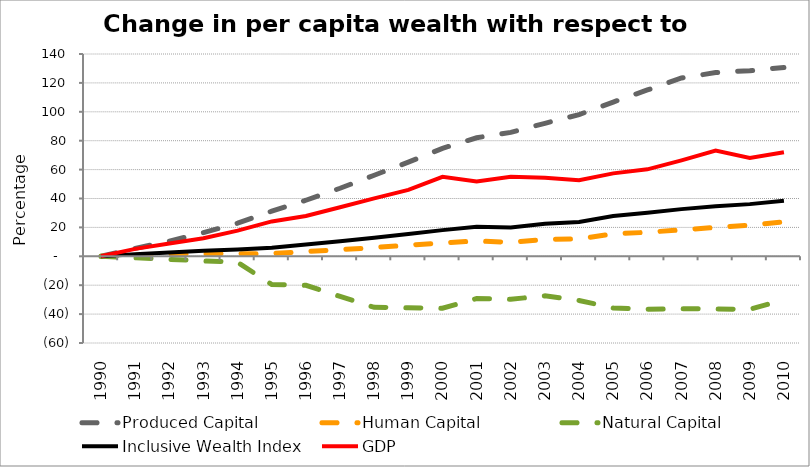
| Category | Produced Capital  | Human Capital | Natural Capital | Inclusive Wealth Index | GDP |
|---|---|---|---|---|---|
| 1990.0 | 0 | 0 | 0 | 0 | 0 |
| 1991.0 | 5.482 | 0.687 | -1.058 | 1.344 | 5.132 |
| 1992.0 | 10.521 | 1.348 | -2.133 | 2.604 | 8.868 |
| 1993.0 | 16.361 | 1.755 | -3.175 | 3.758 | 12.536 |
| 1994.0 | 22.902 | 1.715 | -4.119 | 4.625 | 17.735 |
| 1995.0 | 31.244 | 1.868 | -19.551 | 5.858 | 24.146 |
| 1996.0 | 38.791 | 3.297 | -20.109 | 8.126 | 27.941 |
| 1997.0 | 47.096 | 4.601 | -27.782 | 10.369 | 33.903 |
| 1998.0 | 56.083 | 6.043 | -35.32 | 12.824 | 40.076 |
| 1999.0 | 65.178 | 7.693 | -35.633 | 15.496 | 45.979 |
| 2000.0 | 74.731 | 9.198 | -35.97 | 18.108 | 55.045 |
| 2001.0 | 82.034 | 10.632 | -29.272 | 20.371 | 51.754 |
| 2002.0 | 85.775 | 9.599 | -29.711 | 19.999 | 55.052 |
| 2003.0 | 92.041 | 11.603 | -27.36 | 22.593 | 54.282 |
| 2004.0 | 98.062 | 12.026 | -30.564 | 23.779 | 52.602 |
| 2005.0 | 106.753 | 15.496 | -35.756 | 27.942 | 57.379 |
| 2006.0 | 115.102 | 16.623 | -36.723 | 30.06 | 60.179 |
| 2007.0 | 123.394 | 18.298 | -36.272 | 32.645 | 66.417 |
| 2008.0 | 127.137 | 19.994 | -36.478 | 34.619 | 73.117 |
| 2009.0 | 128.452 | 21.515 | -36.673 | 36.105 | 68.008 |
| 2010.0 | 130.708 | 23.895 | -30.084 | 38.482 | 72.027 |